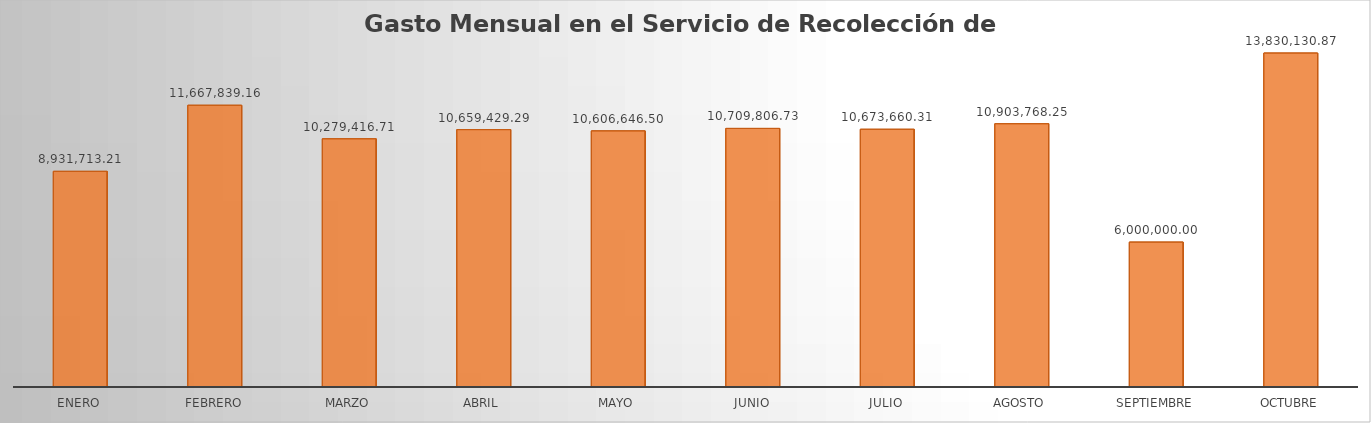
| Category | Monto |
|---|---|
| ENERO | 8931713.21 |
| FEBRERO | 11667839.16 |
| MARZO | 10279416.71 |
| ABRIL | 10659429.29 |
| MAYO | 10606646.5 |
| JUNIO | 10709806.73 |
| JULIO | 10673660.31 |
| AGOSTO | 10903768.25 |
| SEPTIEMBRE | 6000000 |
| OCTUBRE | 13830130.87 |